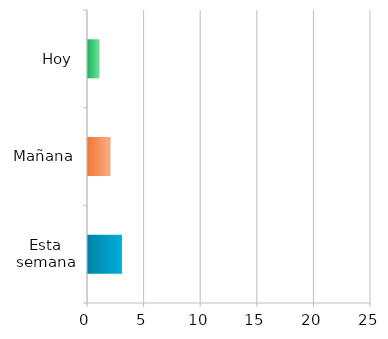
| Category | Series 0 |
|---|---|
| Esta semana | 3 |
| Mañana | 2 |
| Hoy | 1 |